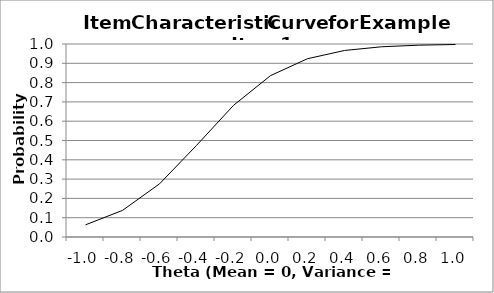
| Category | Series 1 |
|---|---|
| -1.0 | 0.063 |
| -0.8 | 0.138 |
| -0.6 | 0.275 |
| -0.4 | 0.474 |
| -0.2 | 0.682 |
| 0.0 | 0.836 |
| 0.2 | 0.924 |
| 0.4 | 0.966 |
| 0.6 | 0.986 |
| 0.8 | 0.994 |
| 1.0 | 0.997 |